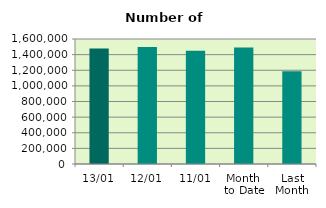
| Category | Series 0 |
|---|---|
| 13/01 | 1479232 |
| 12/01 | 1499080 |
| 11/01 | 1449438 |
| Month 
to Date | 1489718.889 |
| Last
Month | 1187425.652 |